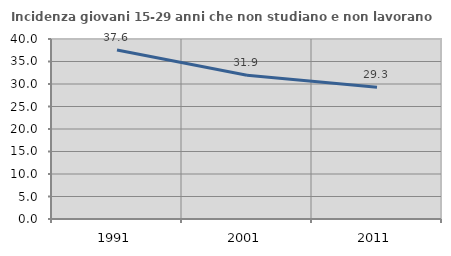
| Category | Incidenza giovani 15-29 anni che non studiano e non lavorano  |
|---|---|
| 1991.0 | 37.55 |
| 2001.0 | 31.938 |
| 2011.0 | 29.27 |